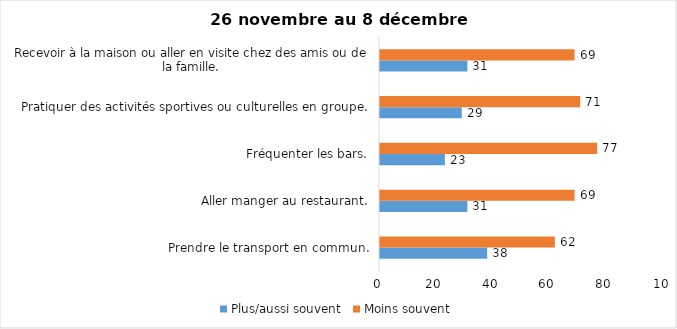
| Category | Plus/aussi souvent | Moins souvent |
|---|---|---|
| Prendre le transport en commun. | 38 | 62 |
| Aller manger au restaurant. | 31 | 69 |
| Fréquenter les bars. | 23 | 77 |
| Pratiquer des activités sportives ou culturelles en groupe. | 29 | 71 |
| Recevoir à la maison ou aller en visite chez des amis ou de la famille. | 31 | 69 |